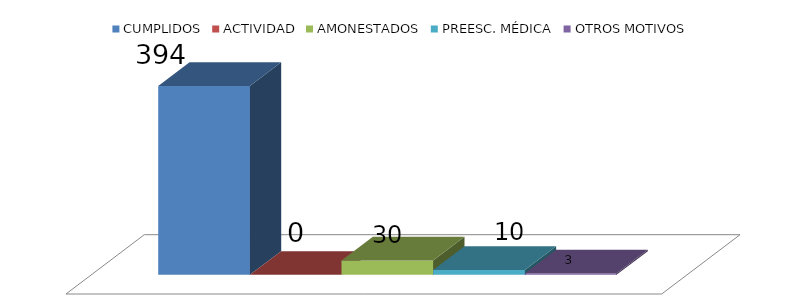
| Category | CUMPLIDOS | ACTIVIDAD | AMONESTADOS | PREESC. MÉDICA | OTROS MOTIVOS |
|---|---|---|---|---|---|
| 0 | 394 | 0 | 30 | 10 | 3 |